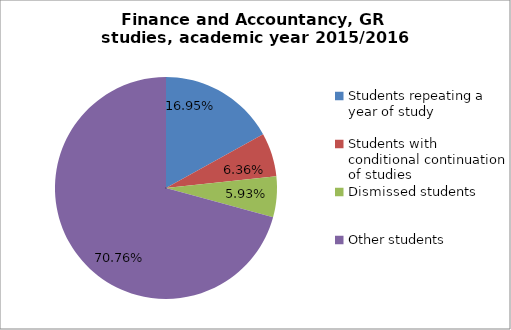
| Category | Series 0 |
|---|---|
| Students repeating a year of study | 40 |
| Students with conditional continuation of studies | 15 |
| Dismissed students | 14 |
| Other students | 167 |